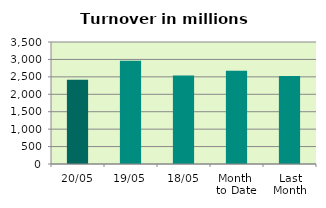
| Category | Series 0 |
|---|---|
| 20/05 | 2418.18 |
| 19/05 | 2964.301 |
| 18/05 | 2540.735 |
| Month 
to Date | 2674.039 |
| Last
Month | 2525.558 |